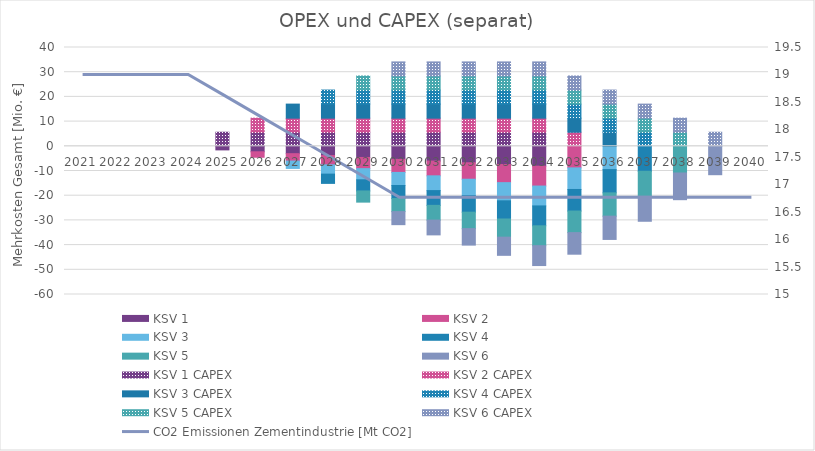
| Category | KSV 1 | KSV 2 | KSV 3 | KSV 4 | KSV 5 | KSV 6 | KSV 1 CAPEX | KSV 2 CAPEX | KSV 3 CAPEX | KSV 4 CAPEX | KSV 5 CAPEX | KSV 6 CAPEX |
|---|---|---|---|---|---|---|---|---|---|---|---|---|
| 0 | 0 | 0 | 0 | 0 | 0 | 0 | 0 | 0 | 0 | 0 | 0 | 0 |
| 1 | 0 | 0 | 0 | 0 | 0 | 0 | 0 | 0 | 0 | 0 | 0 | 0 |
| 2 | 0 | 0 | 0 | 0 | 0 | 0 | 0 | 0 | 0 | 0 | 0 | 0 |
| 3 | 0 | 0 | 0 | 0 | 0 | 0 | 0 | 0 | 0 | 0 | 0 | 0 |
| 4 | -1.454 | 0 | 0 | 0 | 0 | 0 | 5.694 | 0 | 0 | 0 | 0 | 0 |
| 5 | -2.221 | -2.221 | 0 | 0 | 0 | 0 | 5.694 | 5.694 | 0 | 0 | 0 | 0 |
| 6 | -2.987 | -2.987 | -2.987 | 0 | 0 | 0 | 5.694 | 5.694 | 5.694 | 0 | 0 | 0 |
| 7 | -3.754 | -3.754 | -3.754 | -3.754 | 0 | 0 | 5.694 | 5.694 | 5.694 | 5.694 | 0 | 0 |
| 8 | -4.521 | -4.521 | -4.521 | -4.521 | -4.521 | 0 | 5.694 | 5.694 | 5.694 | 5.694 | 5.694 | 0 |
| 9 | -5.287 | -5.287 | -5.287 | -5.287 | -5.287 | -5.287 | 5.694 | 5.694 | 5.694 | 5.694 | 5.694 | 5.694 |
| 10 | -5.977 | -5.977 | -5.977 | -5.977 | -5.977 | -5.977 | 5.694 | 5.694 | 5.694 | 5.694 | 5.694 | 5.694 |
| 11 | -6.667 | -6.667 | -6.667 | -6.667 | -6.667 | -6.667 | 5.694 | 5.694 | 5.694 | 5.694 | 5.694 | 5.694 |
| 12 | -7.357 | -7.357 | -7.357 | -7.357 | -7.357 | -7.357 | 5.694 | 5.694 | 5.694 | 5.694 | 5.694 | 5.694 |
| 13 | -8.047 | -8.047 | -8.047 | -8.047 | -8.047 | -8.047 | 5.694 | 5.694 | 5.694 | 5.694 | 5.694 | 5.694 |
| 14 | 0 | -8.737 | -8.737 | -8.737 | -8.737 | -8.737 | 0 | 5.694 | 5.694 | 5.694 | 5.694 | 5.694 |
| 15 | 0 | 0 | -9.427 | -9.427 | -9.427 | -9.427 | 0 | 0 | 5.694 | 5.694 | 5.694 | 5.694 |
| 16 | 0 | 0 | 0 | -10.117 | -10.117 | -10.117 | 0 | 0 | 0 | 5.694 | 5.694 | 5.694 |
| 17 | 0 | 0 | 0 | 0 | -10.807 | -10.807 | 0 | 0 | 0 | 0 | 5.694 | 5.694 |
| 18 | 0 | 0 | 0 | 0 | 0 | -11.497 | 0 | 0 | 0 | 0 | 0 | 5.694 |
| 19 | 0 | 0 | 0 | 0 | 0 | 0 | 0 | 0 | 0 | 0 | 0 | 0 |